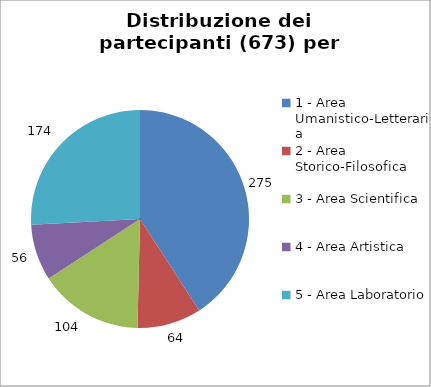
| Category | Nr. Partecipanti |
|---|---|
| 1 - Area Umanistico-Letteraria | 275 |
| 2 - Area Storico-Filosofica | 64 |
| 3 - Area Scientifica | 104 |
| 4 - Area Artistica | 56 |
| 5 - Area Laboratorio | 174 |